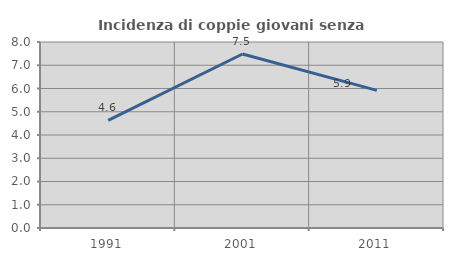
| Category | Incidenza di coppie giovani senza figli |
|---|---|
| 1991.0 | 4.63 |
| 2001.0 | 7.483 |
| 2011.0 | 5.917 |